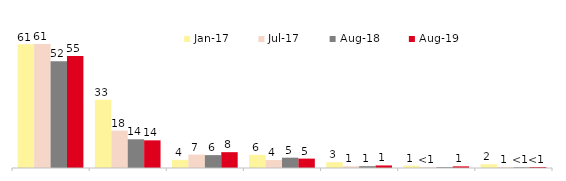
| Category | янв.17 | июл.17 | авг.18 | авг.19 |
|---|---|---|---|---|
| Сбербанк | 60.6 | 60.65 | 52.3 | 54.795 |
| Пенсионный фонд РФ | 33.35 | 18.3 | 14.05 | 13.536 |
| другие коммерческие банки | 4 | 6.55 | 6.3 | 7.742 |
| страховые компании | 6.4 | 3.9 | 5.05 | 4.595 |
| негосударственные пенсионные фонды (НПФ) | 2.85 | 0.85 | 0.9 | 1.249 |
| брокерские и инвестиционные компании, занимающиеся операциями на фондовом рынке | 1.15 | 0.45 | 0.45 | 0.799 |
| управляющие компании, занимающиеся паевыми инвестиционными фондами - ПИФами | 1.85 | 0.5 | 0.4 | 0.5 |